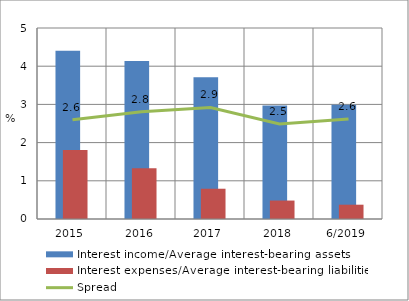
| Category | Interest income/Average interest-bearing assets | Interest expenses/Average interest-bearing liabilities |
|---|---|---|
| 2015 | 4.401 | 1.804 |
| 2016 | 4.136 | 1.33 |
| 2017 | 3.712 | 0.792 |
| 2018 | 2.973 | 0.483 |
| 6/2019 | 2.99 | 0.374 |